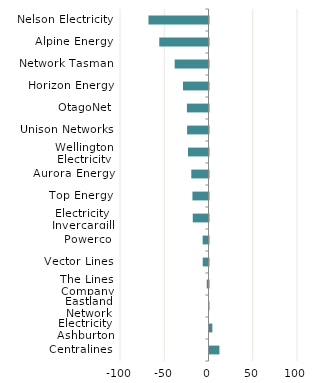
| Category | Series 0 |
|---|---|
| Nelson Electricity | -67.856 |
| Alpine Energy | -55.633 |
| Network Tasman | -38.225 |
| Horizon Energy | -28.788 |
| OtagoNet | -24.379 |
| Unison Networks | -24.184 |
| Wellington Electricity | -23.194 |
| Aurora Energy | -19.452 |
| Top Energy | -18.148 |
| Electricity Invercargill | -17.797 |
| Powerco | -6.63 |
| Vector Lines | -6.513 |
| The Lines Company | -1.989 |
| Eastland Network | -0.007 |
| Electricity Ashburton | 3.189 |
| Centralines | 11.185 |